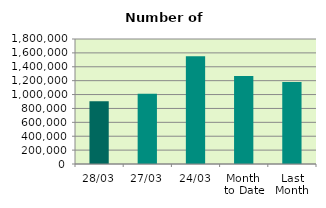
| Category | Series 0 |
|---|---|
| 28/03 | 905000 |
| 27/03 | 1013170 |
| 24/03 | 1553234 |
| Month 
to Date | 1267839.6 |
| Last
Month | 1180310.4 |